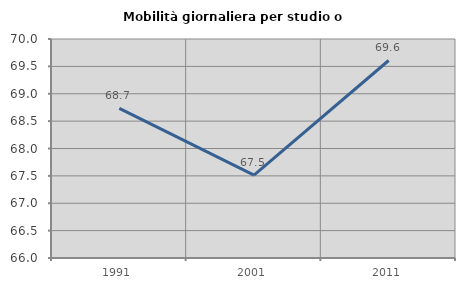
| Category | Mobilità giornaliera per studio o lavoro |
|---|---|
| 1991.0 | 68.733 |
| 2001.0 | 67.513 |
| 2011.0 | 69.607 |